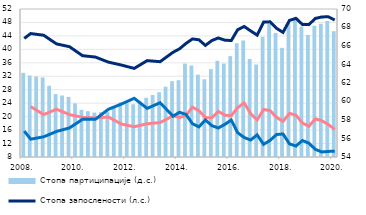
| Category | Стопа партиципације (д.с.) |
|---|---|
| 2008. | 63.1 |
| II | 62.8 |
| III | 62.7 |
| IV | 62.6 |
| 2009. | 61.7 |
| II | 60.8 |
| III | 60.65 |
| IV | 60.5 |
| 2010. | 59.8 |
| II | 59.1 |
| III | 58.95 |
| IV | 58.8 |
| 2011. | 58.85 |
| II | 58.9 |
| III | 59.4 |
| IV | 59.9 |
| 2012. | 59.8 |
| II | 59.7 |
| III | 60.05 |
| IV | 60.4 |
| 2013. | 60.7 |
| II | 61 |
| III | 61.6 |
| IV | 62.2 |
| 2014. | 62.3 |
| II | 64.1 |
| III | 63.9 |
| IV | 62.9 |
| 2015. | 62.4 |
| II | 63.5 |
| III | 64.4 |
| IV | 64.1 |
| 2016. | 64.9 |
| II | 66.3 |
| III | 66.6 |
| IV | 64.6 |
| 2017. | 64 |
| II | 67 |
| III | 68.4 |
| IV | 67.4 |
| 2018. | 65.8 |
| II | 68.5 |
| III | 69 |
| IV | 68.1 |
| 2019. | 67.2 |
| II | 68.2 |
| III | 68.4 |
| IV | 68.7 |
| 2020. | 67.6 |